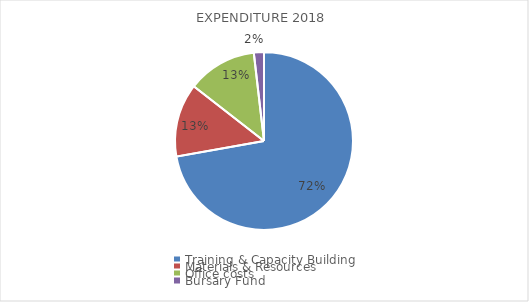
| Category | Series 0 |
|---|---|
| Training & Capacity Building  | 6606980 |
| Materials & Resources | 1221072 |
| Office costs  | 1156164 |
| Bursary Fund | 168000 |